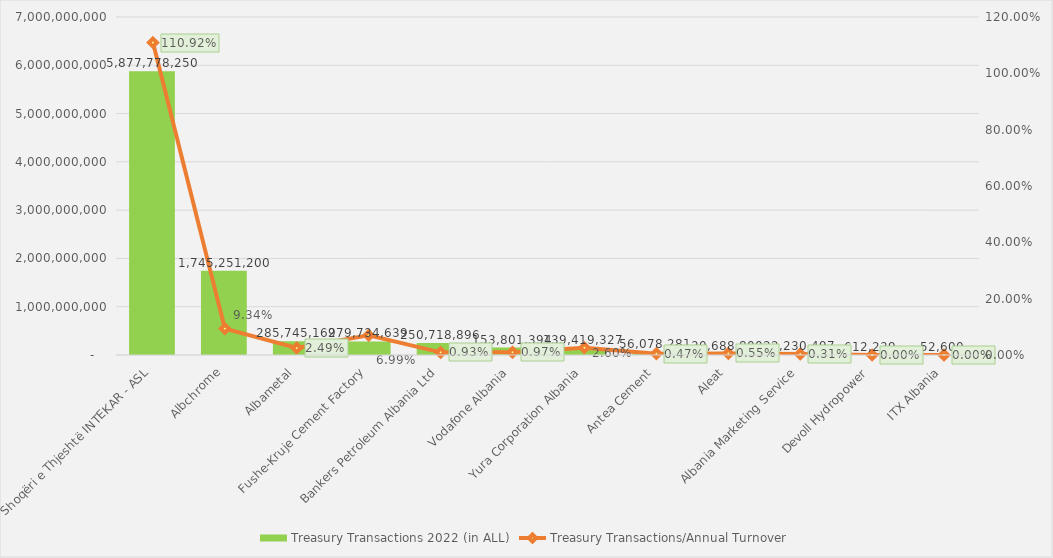
| Category | Treasury Transactions 2022 (in ALL) |
|---|---|
| Shoqëri e Thjeshtë INTEKAR - ASL | 5877778250 |
| Albchrome | 1745251200 |
| Albametal | 285745169 |
| Fushe-Kruje Cement Factory | 279734639 |
| Bankers Petroleum Albania Ltd | 250718896 |
| Vodafone Albania | 153801394 |
| Yura Corporation Albania | 139419327 |
| Antea Cement | 56078281 |
| Aleat | 30688800 |
| Albania Marketing Service | 22230497 |
| Devoll Hydropower | 612239 |
| ITX Albania | 52600 |